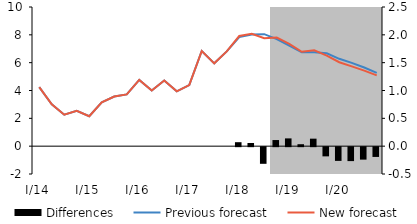
| Category | Differences |
|---|---|
| I/14 | 0 |
| II | 0 |
| III | 0 |
| IV | 0 |
| I/15 | 0 |
| II | 0 |
| III | 0 |
| IV | 0 |
| I/16 | 0 |
| II | 0 |
| III | 0 |
| IV | 0 |
| I/17 | 0 |
| II | 0 |
| III | 0 |
| IV | 0 |
| I/18 | 0.071 |
| II | 0.057 |
| III | -0.299 |
| IV | 0.11 |
| I/19 | 0.14 |
| II | 0.035 |
| III | 0.135 |
| IV | -0.165 |
| I/20 | -0.247 |
| II | -0.25 |
| III | -0.224 |
| IV | -0.176 |